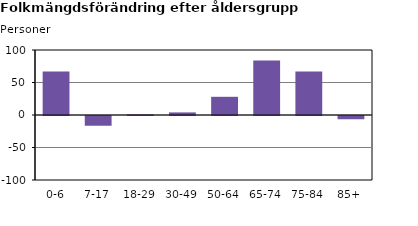
| Category | Series 2 |
|---|---|
| 0-6 | 67 |
| 7-17 | -15 |
| 18-29 | 1 |
| 30-49 | 4 |
| 50-64 | 28 |
| 65-74 | 84 |
| 75-84 | 67 |
| 85+ | -5 |